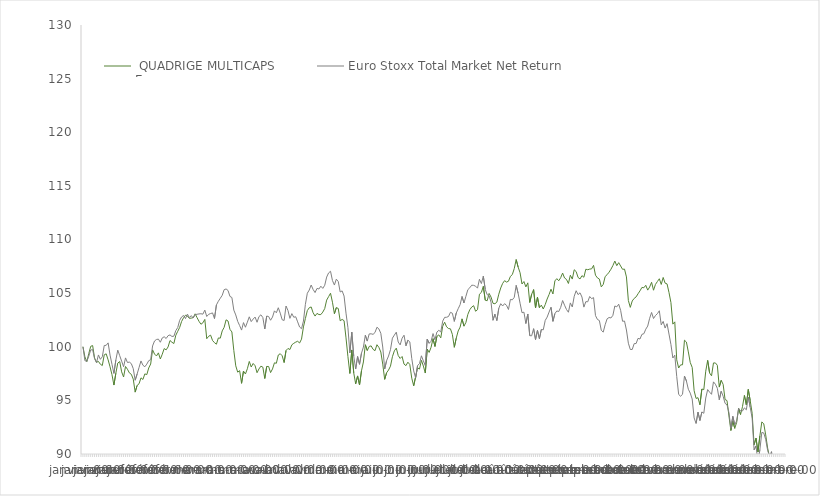
| Category |   QUADRIGE MULTICAPS
Europe  |  Euro Stoxx Total Market Net Return  |
|---|---|---|
| 0 | 100 | 100 |
| 1900-01-01 | 99.06 | 98.703 |
| 1900-01-02 | 98.61 | 98.641 |
| 1900-01-03 | 99.36 | 99.115 |
| 1900-01-04 | 100.04 | 99.701 |
| 1900-01-05 | 100.11 | 99.733 |
| 1900-01-06 | 98.95 | 98.884 |
| 1900-01-07 | 98.56 | 98.515 |
| 1900-01-08 | 98.63 | 99.237 |
| 1900-01-09 | 98.37 | 98.828 |
| 1900-01-10 | 98.25 | 99.066 |
| 1900-01-11 | 99.25 | 100.118 |
| 1900-01-12 | 99.34 | 100.132 |
| 1900-01-13 | 98.78 | 100.36 |
| 1900-01-14 | 98.13 | 99.224 |
| 1900-01-15 | 97.4 | 98.368 |
| 1900-01-16 | 96.43 | 97.516 |
| 1900-01-17 | 97.53 | 98.762 |
| 1900-01-18 | 98.48 | 99.688 |
| 1900-01-19 | 98.62 | 99.167 |
| 1900-01-20 | 97.66 | 98.655 |
| 1900-01-21 | 97.18 | 98.136 |
| 1900-01-22 | 98.16 | 98.96 |
| 1900-01-23 | 97.9 | 98.532 |
| 1900-01-24 | 97.56 | 98.568 |
| 1900-01-25 | 97.43 | 98.426 |
| 1900-01-26 | 96.98 | 97.956 |
| 1900-01-27 | 95.77 | 96.879 |
| 1900-01-28 | 96.39 | 97.457 |
| 1900-01-29 | 96.55 | 98.07 |
| 1900-01-30 | 97.1 | 98.676 |
| 1900-01-31 | 96.95 | 98.273 |
| 1900-02-01 | 97.47 | 98.135 |
| 1900-02-02 | 97.4 | 98.378 |
| 1900-02-03 | 98.02 | 98.701 |
| 1900-02-04 | 98.39 | 98.793 |
| 1900-02-05 | 99.71 | 100.074 |
| 1900-02-06 | 99.32 | 100.537 |
| 1900-02-07 | 99.14 | 100.678 |
| 1900-02-08 | 99.43 | 100.711 |
| 1900-02-09 | 98.86 | 100.421 |
| 1900-02-10 | 99.3 | 100.822 |
| 1900-02-11 | 99.83 | 100.93 |
| 1900-02-12 | 99.71 | 100.767 |
| 1900-02-13 | 99.98 | 101.032 |
| 1900-02-14 | 100.58 | 101.103 |
| 1900-02-15 | 100.42 | 100.959 |
| 1900-02-16 | 100.3 | 100.984 |
| 1900-02-17 | 101.07 | 101.507 |
| 1900-02-18 | 101.44 | 101.791 |
| 1900-02-19 | 101.8 | 102.463 |
| 1900-02-20 | 102.36 | 102.781 |
| 1900-02-21 | 102.7 | 102.917 |
| 1900-02-22 | 102.94 | 102.624 |
| 1900-02-23 | 102.87 | 103.045 |
| 1900-02-24 | 102.65 | 102.719 |
| 1900-02-25 | 102.67 | 102.903 |
| 1900-02-26 | 102.71 | 102.68 |
| 1900-02-27 | 103.07 | 102.993 |
| 1900-02-28 | 102.71 | 103.029 |
| 1900-02-28 | 102.37 | 103.062 |
| 1900-03-01 | 102.1 | 103.077 |
| 1900-03-02 | 102.23 | 103.04 |
| 1900-03-03 | 102.55 | 103.417 |
| 1900-03-04 | 100.75 | 102.821 |
| 1900-03-05 | 100.98 | 103.023 |
| 1900-03-06 | 101.08 | 103.097 |
| 1900-03-07 | 100.58 | 103.153 |
| 1900-03-08 | 100.38 | 102.63 |
| 1900-03-09 | 100.24 | 103.903 |
| 1900-03-10 | 100.82 | 104.241 |
| 1900-03-11 | 100.8 | 104.52 |
| 1900-03-12 | 101.48 | 104.8 |
| 1900-03-13 | 101.81 | 105.323 |
| 1900-03-14 | 102.51 | 105.388 |
| 1900-03-15 | 102.4 | 105.248 |
| 1900-03-16 | 101.62 | 104.693 |
| 1900-03-17 | 101.38 | 104.593 |
| 1900-03-18 | 99.65 | 103.417 |
| 1900-03-19 | 98.22 | 102.965 |
| 1900-03-20 | 97.63 | 102.366 |
| 1900-03-21 | 97.77 | 101.977 |
| 1900-03-22 | 96.59 | 101.553 |
| 1900-03-23 | 97.73 | 102.25 |
| 1900-03-24 | 97.46 | 101.819 |
| 1900-03-25 | 97.95 | 102.292 |
| 1900-03-26 | 98.63 | 102.79 |
| 1900-03-27 | 98.11 | 102.345 |
| 1900-03-28 | 98.44 | 102.582 |
| 1900-03-29 | 98.23 | 102.767 |
| 1900-03-30 | 97.58 | 102.284 |
| 1900-03-31 | 97.93 | 102.81 |
| 1900-04-01 | 98.19 | 102.976 |
| 1900-04-02 | 98.1 | 102.728 |
| 1900-04-03 | 97.04 | 101.657 |
| 1900-04-04 | 98.16 | 102.863 |
| 1900-04-05 | 98.16 | 102.818 |
| 1900-04-06 | 97.59 | 102.472 |
| 1900-04-07 | 97.93 | 102.767 |
| 1900-04-08 | 98.5 | 103.346 |
| 1900-04-09 | 98.46 | 103.167 |
| 1900-04-10 | 99.23 | 103.637 |
| 1900-04-11 | 99.35 | 103.133 |
| 1900-04-12 | 99.16 | 102.514 |
| 1900-04-13 | 98.53 | 102.452 |
| 1900-04-14 | 99.65 | 103.799 |
| 1900-04-15 | 99.84 | 103.377 |
| 1900-04-16 | 99.74 | 102.646 |
| 1900-04-17 | 100.18 | 103.09 |
| 1900-04-18 | 100.32 | 102.75 |
| 1900-04-19 | 100.43 | 102.798 |
| 1900-04-20 | 100.51 | 102.32 |
| 1900-04-21 | 100.35 | 101.839 |
| 1900-04-22 | 100.71 | 101.684 |
| 1900-04-23 | 101.85 | 102.398 |
| 1900-04-24 | 102.63 | 103.948 |
| 1900-04-25 | 103.37 | 104.989 |
| 1900-04-26 | 103.64 | 105.288 |
| 1900-04-27 | 103.71 | 105.756 |
| 1900-04-28 | 103.17 | 105.34 |
| 1900-04-29 | 102.86 | 105.051 |
| 1900-04-30 | 103.11 | 105.439 |
| 1900-05-01 | 103 | 105.385 |
| 1900-05-02 | 103 | 105.645 |
| 1900-05-03 | 103.23 | 105.442 |
| 1900-05-04 | 103.56 | 105.732 |
| 1900-05-05 | 104.35 | 106.497 |
| 1900-05-06 | 104.67 | 106.884 |
| 1900-05-07 | 104.99 | 107.039 |
| 1900-05-08 | 104.15 | 106.173 |
| 1900-05-09 | 103.08 | 105.754 |
| 1900-05-10 | 103.65 | 106.302 |
| 1900-05-11 | 103.57 | 106.081 |
| 1900-05-12 | 102.42 | 105.105 |
| 1900-05-13 | 102.55 | 105.208 |
| 1900-05-14 | 102.43 | 104.727 |
| 1900-05-15 | 100.83 | 103.133 |
| 1900-05-16 | 99.08 | 101.78 |
| 1900-05-17 | 97.51 | 99.427 |
| 1900-05-18 | 99.7 | 101.361 |
| 1900-05-19 | 97.56 | 99.123 |
| 1900-05-20 | 96.54 | 97.924 |
| 1900-05-21 | 97.28 | 99.089 |
| 1900-05-22 | 96.44 | 98.363 |
| 1900-05-23 | 97.75 | 99.401 |
| 1900-05-24 | 98.58 | 99.971 |
| 1900-05-25 | 100.19 | 101.074 |
| 1900-05-26 | 99.65 | 100.528 |
| 1900-05-27 | 100.03 | 101.196 |
| 1900-05-28 | 100.08 | 101.207 |
| 1900-05-29 | 99.76 | 101.156 |
| 1900-05-30 | 99.63 | 101.33 |
| 1900-05-31 | 100.19 | 101.82 |
| 1900-06-01 | 99.94 | 101.664 |
| 1900-06-02 | 99.51 | 101.252 |
| 1900-06-03 | 98.38 | 99.975 |
| 1900-06-04 | 96.96 | 97.922 |
| 1900-06-05 | 97.58 | 98.714 |
| 1900-06-06 | 97.83 | 99.136 |
| 1900-06-07 | 98.19 | 99.728 |
| 1900-06-08 | 99.07 | 100.802 |
| 1900-06-09 | 99.62 | 101.086 |
| 1900-06-10 | 99.87 | 101.359 |
| 1900-06-11 | 99.18 | 100.438 |
| 1900-06-12 | 98.91 | 100.172 |
| 1900-06-13 | 99.09 | 100.793 |
| 1900-06-14 | 98.38 | 101.075 |
| 1900-06-15 | 98.24 | 100.087 |
| 1900-06-16 | 98.56 | 100.613 |
| 1900-06-17 | 98.34 | 100.452 |
| 1900-06-18 | 97.07 | 98.908 |
| 1900-06-19 | 96.36 | 97.748 |
| 1900-06-20 | 97.2 | 97.1 |
| 1900-06-21 | 98.03 | 98.236 |
| 1900-06-22 | 97.92 | 98.434 |
| 1900-06-23 | 98.73 | 99.157 |
| 1900-06-24 | 98.2 | 98.679 |
| 1900-06-25 | 97.55 | 98.256 |
| 1900-06-26 | 99.79 | 100.714 |
| 1900-06-27 | 99.47 | 100.321 |
| 1900-06-28 | 99.96 | 100.512 |
| 1900-06-29 | 100.76 | 101.229 |
| 1900-06-30 | 100.03 | 100.649 |
| 1900-07-01 | 100.97 | 101.372 |
| 1900-07-02 | 101.11 | 101.533 |
| 1900-07-03 | 100.83 | 101.378 |
| 1900-07-04 | 101.92 | 102.393 |
| 1900-07-05 | 102.29 | 102.739 |
| 1900-07-06 | 101.86 | 102.748 |
| 1900-07-07 | 101.7 | 102.821 |
| 1900-07-08 | 101.67 | 103.211 |
| 1900-07-09 | 101.15 | 103.127 |
| 1900-07-10 | 99.95 | 102.365 |
| 1900-07-11 | 100.8 | 103.141 |
| 1900-07-12 | 101.47 | 103.549 |
| 1900-07-13 | 101.83 | 103.921 |
| 1900-07-14 | 102.6 | 104.689 |
| 1900-07-15 | 101.92 | 104.078 |
| 1900-07-16 | 102.27 | 104.705 |
| 1900-07-17 | 103.02 | 105.324 |
| 1900-07-18 | 103.45 | 105.498 |
| 1900-07-19 | 103.7 | 105.74 |
| 1900-07-20 | 103.83 | 105.725 |
| 1900-07-21 | 103.31 | 105.648 |
| 1900-07-22 | 103.46 | 105.464 |
| 1900-07-23 | 104.9 | 106.291 |
| 1900-07-24 | 105.07 | 105.891 |
| 1900-07-25 | 105.63 | 106.583 |
| 1900-07-26 | 104.34 | 105.347 |
| 1900-07-27 | 104.29 | 104.849 |
| 1900-07-28 | 104.97 | 104.762 |
| 1900-07-29 | 104.63 | 104.142 |
| 1900-07-30 | 104.05 | 102.469 |
| 1900-07-31 | 104.01 | 103.048 |
| 1900-08-01 | 104.16 | 102.436 |
| 1900-08-02 | 104.9 | 103.588 |
| 1900-08-03 | 105.48 | 104.014 |
| 1900-08-04 | 105.91 | 103.802 |
| 1900-08-05 | 106.16 | 104.016 |
| 1900-08-06 | 106.03 | 103.862 |
| 1900-08-07 | 106.11 | 103.474 |
| 1900-08-08 | 106.56 | 104.412 |
| 1900-08-09 | 106.73 | 104.378 |
| 1900-08-10 | 107.29 | 104.606 |
| 1900-08-11 | 108.13 | 105.72 |
| 1900-08-12 | 107.43 | 104.973 |
| 1900-08-13 | 106.9 | 104.058 |
| 1900-08-14 | 105.85 | 103.172 |
| 1900-08-15 | 106.08 | 103.223 |
| 1900-08-16 | 105.58 | 102.165 |
| 1900-08-17 | 105.96 | 103.054 |
| 1900-08-18 | 104.13 | 101.033 |
| 1900-08-19 | 104.9 | 101.021 |
| 1900-08-20 | 105.33 | 101.684 |
| 1900-08-21 | 103.62 | 100.672 |
| 1900-08-22 | 104.62 | 101.529 |
| 1900-08-23 | 103.64 | 100.754 |
| 1900-08-24 | 103.88 | 101.614 |
| 1900-08-25 | 103.52 | 101.577 |
| 1900-08-26 | 103.93 | 102.453 |
| 1900-08-27 | 104.45 | 102.764 |
| 1900-08-28 | 104.87 | 103.232 |
| 1900-08-29 | 105.37 | 103.682 |
| 1900-08-30 | 104.92 | 102.37 |
| 1900-08-31 | 106.14 | 103.088 |
| 1900-09-01 | 106.35 | 103.338 |
| 1900-09-02 | 106.15 | 103.284 |
| 1900-09-03 | 106.44 | 103.672 |
| 1900-09-04 | 106.87 | 104.309 |
| 1900-09-05 | 106.41 | 103.873 |
| 1900-09-06 | 106.28 | 103.478 |
| 1900-09-07 | 105.9 | 103.217 |
| 1900-09-08 | 106.67 | 104.089 |
| 1900-09-09 | 106.31 | 103.71 |
| 1900-09-10 | 107.18 | 104.71 |
| 1900-09-11 | 107.01 | 105.223 |
| 1900-09-12 | 106.46 | 104.86 |
| 1900-09-13 | 106.32 | 105.029 |
| 1900-09-14 | 106.63 | 104.635 |
| 1900-09-15 | 106.48 | 103.695 |
| 1900-09-16 | 107.23 | 104.204 |
| 1900-09-17 | 107.18 | 104.193 |
| 1900-09-18 | 107.24 | 104.685 |
| 1900-09-19 | 107.26 | 104.483 |
| 1900-09-20 | 107.59 | 104.581 |
| 1900-09-21 | 106.67 | 102.905 |
| 1900-09-22 | 106.42 | 102.546 |
| 1900-09-23 | 106.31 | 102.444 |
| 1900-09-24 | 105.58 | 101.533 |
| 1900-09-25 | 105.81 | 101.364 |
| 1900-09-26 | 106.55 | 102.056 |
| 1900-09-27 | 106.72 | 102.602 |
| 1900-09-28 | 106.95 | 102.728 |
| 1900-09-29 | 107.23 | 102.685 |
| 1900-09-30 | 107.57 | 102.928 |
| 1900-10-01 | 107.99 | 103.8 |
| 1900-10-02 | 107.56 | 103.723 |
| 1900-10-03 | 107.84 | 103.968 |
| 1900-10-04 | 107.53 | 103.394 |
| 1900-10-05 | 107.22 | 102.374 |
| 1900-10-06 | 107.24 | 102.396 |
| 1900-10-07 | 106.51 | 101.561 |
| 1900-10-08 | 104.31 | 100.329 |
| 1900-10-09 | 103.67 | 99.742 |
| 1900-10-10 | 104.27 | 99.749 |
| 1900-10-11 | 104.51 | 100.29 |
| 1900-10-12 | 104.65 | 100.303 |
| 1900-10-13 | 104.94 | 100.784 |
| 1900-10-14 | 105.21 | 100.722 |
| 1900-10-15 | 105.53 | 101.155 |
| 1900-10-16 | 105.5 | 101.215 |
| 1900-10-17 | 105.73 | 101.639 |
| 1900-10-18 | 105.28 | 101.929 |
| 1900-10-19 | 105.57 | 102.654 |
| 1900-10-20 | 106.01 | 103.197 |
| 1900-10-21 | 105.27 | 102.632 |
| 1900-10-22 | 105.81 | 102.908 |
| 1900-10-23 | 106.08 | 103.082 |
| 1900-10-24 | 106.34 | 103.357 |
| 1900-10-25 | 105.81 | 102.041 |
| 1900-10-26 | 106.46 | 102.362 |
| 1900-10-27 | 105.93 | 101.743 |
| 1900-10-28 | 105.86 | 102.152 |
| 1900-10-29 | 105.06 | 101.184 |
| 1900-10-30 | 104.12 | 100.214 |
| 1900-10-31 | 102.11 | 98.951 |
| 1900-11-01 | 102.32 | 99.215 |
| 1900-11-02 | 98.78 | 97.233 |
| 1900-11-03 | 98.02 | 95.553 |
| 1900-11-04 | 98.31 | 95.39 |
| 1900-11-05 | 98.32 | 95.563 |
| 1900-11-06 | 100.61 | 97.263 |
| 1900-11-07 | 100.44 | 96.813 |
| 1900-11-08 | 99.52 | 96.038 |
| 1900-11-09 | 98.53 | 95.675 |
| 1900-11-10 | 98.07 | 95.126 |
| 1900-11-11 | 95.9 | 93.363 |
| 1900-11-12 | 95.18 | 92.852 |
| 1900-11-13 | 95.25 | 93.901 |
| 1900-11-14 | 94.59 | 93.127 |
| 1900-11-15 | 96.06 | 93.92 |
| 1900-11-16 | 96 | 93.796 |
| 1900-11-17 | 97.72 | 95.217 |
| 1900-11-18 | 98.73 | 96.007 |
| 1900-11-19 | 97.55 | 95.767 |
| 1900-11-20 | 97.29 | 95.567 |
| 1900-11-21 | 98.49 | 96.726 |
| 1900-11-22 | 98.49 | 96.504 |
| 1900-11-23 | 98.27 | 96.127 |
| 1900-11-24 | 96.24 | 95.061 |
| 1900-11-25 | 96.87 | 95.852 |
| 1900-11-26 | 96.49 | 95.385 |
| 1900-11-27 | 95.08 | 94.725 |
| 1900-11-28 | 94.98 | 94.584 |
| 1900-11-29 | 93.55 | 93.856 |
| 1900-11-30 | 92.19 | 92.399 |
| 1900-12-01 | 93.08 | 93.51 |
| 1900-12-02 | 92.39 | 92.736 |
| 1900-12-03 | 92.95 | 93.087 |
| 1900-12-04 | 94.25 | 94.246 |
| 1900-12-05 | 93.68 | 94.024 |
| 1900-12-06 | 94.41 | 94.012 |
| 1900-12-07 | 95.46 | 94.299 |
| 1900-12-08 | 94.58 | 94.12 |
| 1900-12-09 | 96.02 | 95.317 |
| 1900-12-10 | 94.97 | 94.345 |
| 1900-12-11 | 93.8 | 93.348 |
| 1900-12-12 | 90.86 | 90.387 |
| 1900-12-13 | 91.48 | 90.75 |
| 1900-12-14 | 90.19 | 89.266 |
| 1900-12-15 | 91.69 | 90.407 |
| 1900-12-16 | 92.99 | 92.015 |
| 1900-12-17 | 92.82 | 91.96 |
| 1900-12-18 | 91.78 | 91.352 |
| 1900-12-19 | 90.55 | 90.342 |
| 1900-12-20 | 89.72 | 89.785 |
| 1900-12-21 | 89.89 | 90.216 |
| 1900-12-22 | 87.91 | 88.59 |
| 1900-12-23 | 87.89 | 88.462 |
| 1900-12-24 | 87.35 | 87.881 |
| 1900-12-25 | 86.83 | 86.715 |
| 1900-12-26 | 88.5 | 88.161 |
| 1900-12-27 | 89.08 | 88.649 |
| 1900-12-28 | 88.97 | 88.47 |